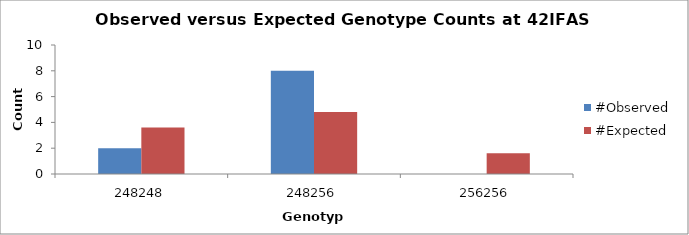
| Category | #Observed | #Expected |
|---|---|---|
| 248248.0 | 2 | 3.6 |
| 248256.0 | 8 | 4.8 |
| 256256.0 | 0 | 1.6 |